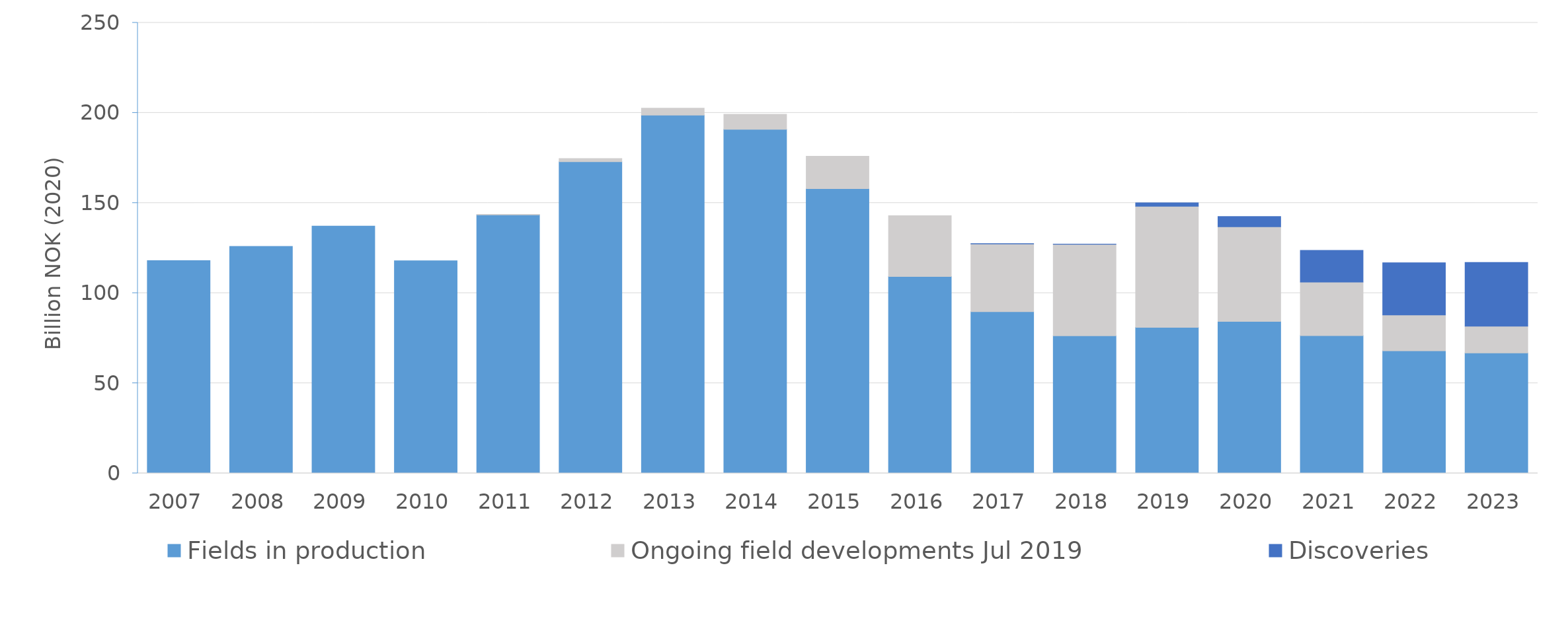
| Category | Fields in production | Ongoing field developments Jul 2019 | Discoveries |
|---|---|---|---|
| 2007.0 | 117.992 | 0 | 0 |
| 2008.0 | 125.878 | 0 | 0 |
| 2009.0 | 137.224 | 0 | 0 |
| 2010.0 | 117.973 | 0 | 0 |
| 2011.0 | 143.413 | 0.248 | 0 |
| 2012.0 | 172.911 | 1.751 | 0 |
| 2013.0 | 198.757 | 3.828 | 0 |
| 2014.0 | 190.91 | 8.328 | 0 |
| 2015.0 | 158.03 | 17.968 | 0 |
| 2016.0 | 109.262 | 33.729 | 0 |
| 2017.0 | 89.675 | 37.615 | 0.198 |
| 2018.0 | 76.352 | 50.738 | 0.087 |
| 2019.0 | 80.987 | 67.189 | 1.91 |
| 2020.0 | 84.312 | 52.516 | 5.658 |
| 2021.0 | 76.394 | 29.769 | 17.524 |
| 2022.0 | 68.037 | 19.863 | 28.906 |
| 2023.0 | 66.853 | 14.761 | 35.406 |